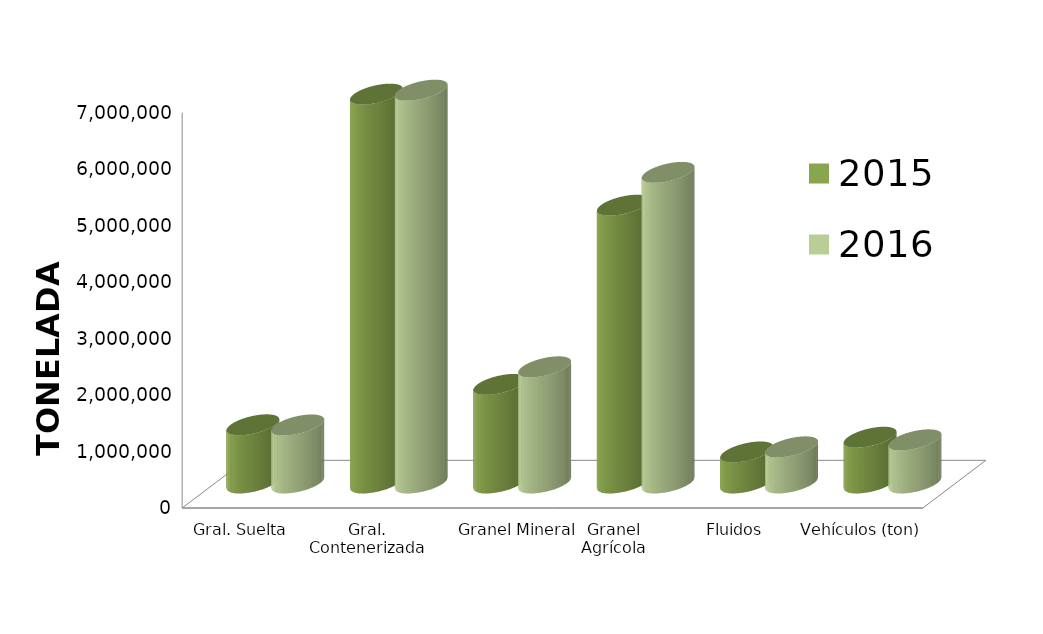
| Category | 2015 | 2016 |
|---|---|---|
| Gral. Suelta | 1030642.93 | 1028267.617 |
| Gral. Contenerizada | 6886311.356 | 6956349.259 |
| Granel Mineral | 1746051.54 | 2057875.248 |
| Granel Agrícola | 4919549.005 | 5500563.246 |
| Fluidos | 550419.634 | 640761.804 |
| Vehículos (ton) | 810859.608 | 764872.136 |